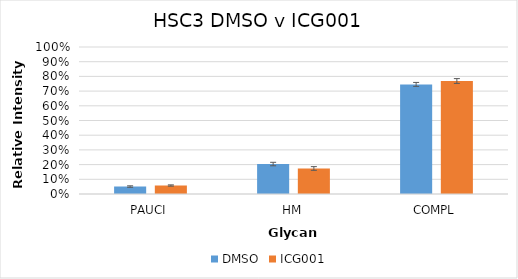
| Category | DMSO | ICG001 |
|---|---|---|
| PAUCI | 0.051 | 0.058 |
| HM | 0.204 | 0.174 |
| COMPL | 0.746 | 0.769 |